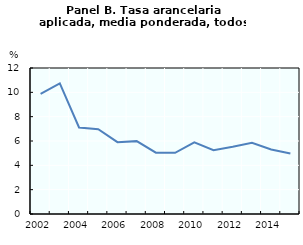
| Category | Series 0 |
|---|---|
| 0 | 9.869 |
| 1 | 10.739 |
| 2 | 7.113 |
| 3 | 6.971 |
| 4 | 5.903 |
| 5 | 5.989 |
| 6 | 5.04 |
| 7 | 5.025 |
| 8 | 5.887 |
| 9 | 5.25 |
| 10 | 5.52 |
| 11 | 5.847 |
| 12 | 5.299 |
| 13 | 4.964 |